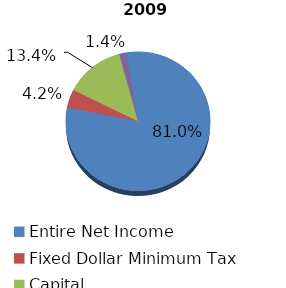
| Category | Series 0 |
|---|---|
| Entire Net Income | 1445009943 |
| Fixed Dollar Minimum Tax | 74415891 |
| Capital | 239698164 |
| Alternative Minimum Taxable Income | 25092346 |